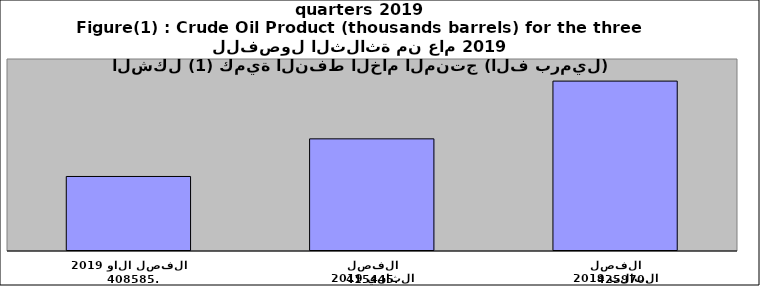
| Category | Series 0 |
|---|---|
| 2019 الفصل الاول | 408585 |
| 2019 الفصل الثاني | 415445 |
| 2019 الفصل الثالث | 425970 |